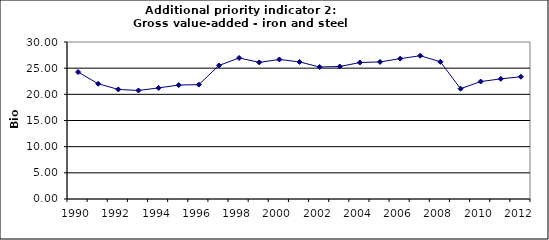
| Category | Gross value-added - iron and steel industry, Bio Euro (EC95) |
|---|---|
| 1990 | 24.261 |
| 1991 | 22.016 |
| 1992 | 20.939 |
| 1993 | 20.737 |
| 1994 | 21.231 |
| 1995 | 21.77 |
| 1996 | 21.859 |
| 1997 | 25.517 |
| 1998 | 26.954 |
| 1999 | 26.101 |
| 2000 | 26.662 |
| 2001 | 26.191 |
| 2002 | 25.226 |
| 2003 | 25.316 |
| 2004 | 26.079 |
| 2005 | 26.191 |
| 2006 | 26.819 |
| 2007 | 27.38 |
| 2008 | 26.213 |
| 2009 | 21.074 |
| 2010 | 22.443 |
| 2011 | 22.959 |
| 2012 | 23.363 |